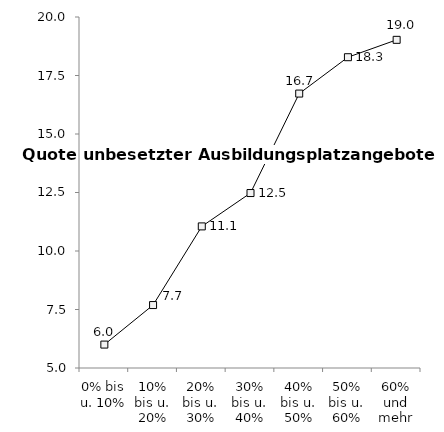
| Category | Quote unbesetzter Plätze |
|---|---|
| 0% bis u. 10% | 6.001 |
| 10% bis u. 20% | 7.69 |
| 20% bis u. 30% | 11.051 |
| 30% bis u. 40% | 12.477 |
| 40% bis u. 50% | 16.728 |
| 50% bis u. 60% | 18.282 |
| 60% und mehr | 19.024 |